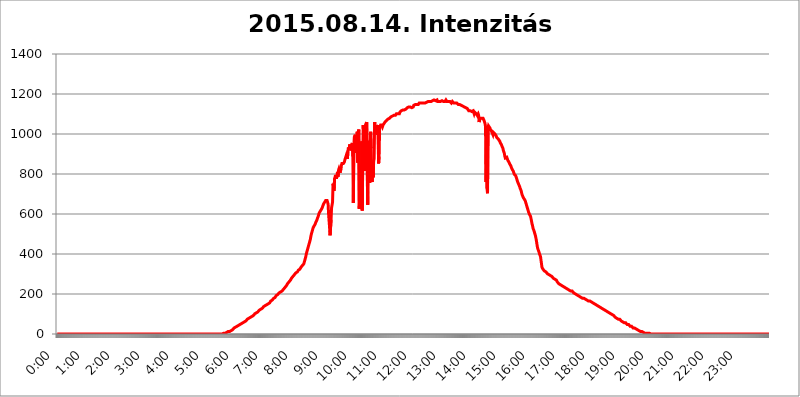
| Category | 2015.08.14. Intenzitás [W/m^2] |
|---|---|
| 0.0 | 0 |
| 0.0006944444444444445 | 0 |
| 0.001388888888888889 | 0 |
| 0.0020833333333333333 | 0 |
| 0.002777777777777778 | 0 |
| 0.003472222222222222 | 0 |
| 0.004166666666666667 | 0 |
| 0.004861111111111111 | 0 |
| 0.005555555555555556 | 0 |
| 0.0062499999999999995 | 0 |
| 0.006944444444444444 | 0 |
| 0.007638888888888889 | 0 |
| 0.008333333333333333 | 0 |
| 0.009027777777777779 | 0 |
| 0.009722222222222222 | 0 |
| 0.010416666666666666 | 0 |
| 0.011111111111111112 | 0 |
| 0.011805555555555555 | 0 |
| 0.012499999999999999 | 0 |
| 0.013194444444444444 | 0 |
| 0.013888888888888888 | 0 |
| 0.014583333333333332 | 0 |
| 0.015277777777777777 | 0 |
| 0.015972222222222224 | 0 |
| 0.016666666666666666 | 0 |
| 0.017361111111111112 | 0 |
| 0.018055555555555557 | 0 |
| 0.01875 | 0 |
| 0.019444444444444445 | 0 |
| 0.02013888888888889 | 0 |
| 0.020833333333333332 | 0 |
| 0.02152777777777778 | 0 |
| 0.022222222222222223 | 0 |
| 0.02291666666666667 | 0 |
| 0.02361111111111111 | 0 |
| 0.024305555555555556 | 0 |
| 0.024999999999999998 | 0 |
| 0.025694444444444447 | 0 |
| 0.02638888888888889 | 0 |
| 0.027083333333333334 | 0 |
| 0.027777777777777776 | 0 |
| 0.02847222222222222 | 0 |
| 0.029166666666666664 | 0 |
| 0.029861111111111113 | 0 |
| 0.030555555555555555 | 0 |
| 0.03125 | 0 |
| 0.03194444444444445 | 0 |
| 0.03263888888888889 | 0 |
| 0.03333333333333333 | 0 |
| 0.034027777777777775 | 0 |
| 0.034722222222222224 | 0 |
| 0.035416666666666666 | 0 |
| 0.036111111111111115 | 0 |
| 0.03680555555555556 | 0 |
| 0.0375 | 0 |
| 0.03819444444444444 | 0 |
| 0.03888888888888889 | 0 |
| 0.03958333333333333 | 0 |
| 0.04027777777777778 | 0 |
| 0.04097222222222222 | 0 |
| 0.041666666666666664 | 0 |
| 0.042361111111111106 | 0 |
| 0.04305555555555556 | 0 |
| 0.043750000000000004 | 0 |
| 0.044444444444444446 | 0 |
| 0.04513888888888889 | 0 |
| 0.04583333333333334 | 0 |
| 0.04652777777777778 | 0 |
| 0.04722222222222222 | 0 |
| 0.04791666666666666 | 0 |
| 0.04861111111111111 | 0 |
| 0.049305555555555554 | 0 |
| 0.049999999999999996 | 0 |
| 0.05069444444444445 | 0 |
| 0.051388888888888894 | 0 |
| 0.052083333333333336 | 0 |
| 0.05277777777777778 | 0 |
| 0.05347222222222222 | 0 |
| 0.05416666666666667 | 0 |
| 0.05486111111111111 | 0 |
| 0.05555555555555555 | 0 |
| 0.05625 | 0 |
| 0.05694444444444444 | 0 |
| 0.057638888888888885 | 0 |
| 0.05833333333333333 | 0 |
| 0.05902777777777778 | 0 |
| 0.059722222222222225 | 0 |
| 0.06041666666666667 | 0 |
| 0.061111111111111116 | 0 |
| 0.06180555555555556 | 0 |
| 0.0625 | 0 |
| 0.06319444444444444 | 0 |
| 0.06388888888888888 | 0 |
| 0.06458333333333334 | 0 |
| 0.06527777777777778 | 0 |
| 0.06597222222222222 | 0 |
| 0.06666666666666667 | 0 |
| 0.06736111111111111 | 0 |
| 0.06805555555555555 | 0 |
| 0.06874999999999999 | 0 |
| 0.06944444444444443 | 0 |
| 0.07013888888888889 | 0 |
| 0.07083333333333333 | 0 |
| 0.07152777777777779 | 0 |
| 0.07222222222222223 | 0 |
| 0.07291666666666667 | 0 |
| 0.07361111111111111 | 0 |
| 0.07430555555555556 | 0 |
| 0.075 | 0 |
| 0.07569444444444444 | 0 |
| 0.0763888888888889 | 0 |
| 0.07708333333333334 | 0 |
| 0.07777777777777778 | 0 |
| 0.07847222222222222 | 0 |
| 0.07916666666666666 | 0 |
| 0.0798611111111111 | 0 |
| 0.08055555555555556 | 0 |
| 0.08125 | 0 |
| 0.08194444444444444 | 0 |
| 0.08263888888888889 | 0 |
| 0.08333333333333333 | 0 |
| 0.08402777777777777 | 0 |
| 0.08472222222222221 | 0 |
| 0.08541666666666665 | 0 |
| 0.08611111111111112 | 0 |
| 0.08680555555555557 | 0 |
| 0.08750000000000001 | 0 |
| 0.08819444444444445 | 0 |
| 0.08888888888888889 | 0 |
| 0.08958333333333333 | 0 |
| 0.09027777777777778 | 0 |
| 0.09097222222222222 | 0 |
| 0.09166666666666667 | 0 |
| 0.09236111111111112 | 0 |
| 0.09305555555555556 | 0 |
| 0.09375 | 0 |
| 0.09444444444444444 | 0 |
| 0.09513888888888888 | 0 |
| 0.09583333333333333 | 0 |
| 0.09652777777777777 | 0 |
| 0.09722222222222222 | 0 |
| 0.09791666666666667 | 0 |
| 0.09861111111111111 | 0 |
| 0.09930555555555555 | 0 |
| 0.09999999999999999 | 0 |
| 0.10069444444444443 | 0 |
| 0.1013888888888889 | 0 |
| 0.10208333333333335 | 0 |
| 0.10277777777777779 | 0 |
| 0.10347222222222223 | 0 |
| 0.10416666666666667 | 0 |
| 0.10486111111111111 | 0 |
| 0.10555555555555556 | 0 |
| 0.10625 | 0 |
| 0.10694444444444444 | 0 |
| 0.1076388888888889 | 0 |
| 0.10833333333333334 | 0 |
| 0.10902777777777778 | 0 |
| 0.10972222222222222 | 0 |
| 0.1111111111111111 | 0 |
| 0.11180555555555556 | 0 |
| 0.11180555555555556 | 0 |
| 0.1125 | 0 |
| 0.11319444444444444 | 0 |
| 0.11388888888888889 | 0 |
| 0.11458333333333333 | 0 |
| 0.11527777777777777 | 0 |
| 0.11597222222222221 | 0 |
| 0.11666666666666665 | 0 |
| 0.1173611111111111 | 0 |
| 0.11805555555555557 | 0 |
| 0.11944444444444445 | 0 |
| 0.12013888888888889 | 0 |
| 0.12083333333333333 | 0 |
| 0.12152777777777778 | 0 |
| 0.12222222222222223 | 0 |
| 0.12291666666666667 | 0 |
| 0.12291666666666667 | 0 |
| 0.12361111111111112 | 0 |
| 0.12430555555555556 | 0 |
| 0.125 | 0 |
| 0.12569444444444444 | 0 |
| 0.12638888888888888 | 0 |
| 0.12708333333333333 | 0 |
| 0.16875 | 0 |
| 0.12847222222222224 | 0 |
| 0.12916666666666668 | 0 |
| 0.12986111111111112 | 0 |
| 0.13055555555555556 | 0 |
| 0.13125 | 0 |
| 0.13194444444444445 | 0 |
| 0.1326388888888889 | 0 |
| 0.13333333333333333 | 0 |
| 0.13402777777777777 | 0 |
| 0.13402777777777777 | 0 |
| 0.13472222222222222 | 0 |
| 0.13541666666666666 | 0 |
| 0.1361111111111111 | 0 |
| 0.13749999999999998 | 0 |
| 0.13819444444444443 | 0 |
| 0.1388888888888889 | 0 |
| 0.13958333333333334 | 0 |
| 0.14027777777777778 | 0 |
| 0.14097222222222222 | 0 |
| 0.14166666666666666 | 0 |
| 0.1423611111111111 | 0 |
| 0.14305555555555557 | 0 |
| 0.14375000000000002 | 0 |
| 0.14444444444444446 | 0 |
| 0.1451388888888889 | 0 |
| 0.1451388888888889 | 0 |
| 0.14652777777777778 | 0 |
| 0.14722222222222223 | 0 |
| 0.14791666666666667 | 0 |
| 0.1486111111111111 | 0 |
| 0.14930555555555555 | 0 |
| 0.15 | 0 |
| 0.15069444444444444 | 0 |
| 0.15138888888888888 | 0 |
| 0.15208333333333332 | 0 |
| 0.15277777777777776 | 0 |
| 0.15347222222222223 | 0 |
| 0.15416666666666667 | 0 |
| 0.15486111111111112 | 0 |
| 0.15555555555555556 | 0 |
| 0.15625 | 0 |
| 0.15694444444444444 | 0 |
| 0.15763888888888888 | 0 |
| 0.15833333333333333 | 0 |
| 0.15902777777777777 | 0 |
| 0.15972222222222224 | 0 |
| 0.16041666666666668 | 0 |
| 0.16111111111111112 | 0 |
| 0.16180555555555556 | 0 |
| 0.1625 | 0 |
| 0.16319444444444445 | 0 |
| 0.1638888888888889 | 0 |
| 0.16458333333333333 | 0 |
| 0.16527777777777777 | 0 |
| 0.16597222222222222 | 0 |
| 0.16666666666666666 | 0 |
| 0.1673611111111111 | 0 |
| 0.16805555555555554 | 0 |
| 0.16874999999999998 | 0 |
| 0.16944444444444443 | 0 |
| 0.17013888888888887 | 0 |
| 0.1708333333333333 | 0 |
| 0.17152777777777775 | 0 |
| 0.17222222222222225 | 0 |
| 0.1729166666666667 | 0 |
| 0.17361111111111113 | 0 |
| 0.17430555555555557 | 0 |
| 0.17500000000000002 | 0 |
| 0.17569444444444446 | 0 |
| 0.1763888888888889 | 0 |
| 0.17708333333333334 | 0 |
| 0.17777777777777778 | 0 |
| 0.17847222222222223 | 0 |
| 0.17916666666666667 | 0 |
| 0.1798611111111111 | 0 |
| 0.18055555555555555 | 0 |
| 0.18125 | 0 |
| 0.18194444444444444 | 0 |
| 0.1826388888888889 | 0 |
| 0.18333333333333335 | 0 |
| 0.1840277777777778 | 0 |
| 0.18472222222222223 | 0 |
| 0.18541666666666667 | 0 |
| 0.18611111111111112 | 0 |
| 0.18680555555555556 | 0 |
| 0.1875 | 0 |
| 0.18819444444444444 | 0 |
| 0.18888888888888888 | 0 |
| 0.18958333333333333 | 0 |
| 0.19027777777777777 | 0 |
| 0.1909722222222222 | 0 |
| 0.19166666666666665 | 0 |
| 0.19236111111111112 | 0 |
| 0.19305555555555554 | 0 |
| 0.19375 | 0 |
| 0.19444444444444445 | 0 |
| 0.1951388888888889 | 0 |
| 0.19583333333333333 | 0 |
| 0.19652777777777777 | 0 |
| 0.19722222222222222 | 0 |
| 0.19791666666666666 | 0 |
| 0.1986111111111111 | 0 |
| 0.19930555555555554 | 0 |
| 0.19999999999999998 | 0 |
| 0.20069444444444443 | 0 |
| 0.20138888888888887 | 0 |
| 0.2020833333333333 | 0 |
| 0.2027777777777778 | 0 |
| 0.2034722222222222 | 0 |
| 0.2041666666666667 | 0 |
| 0.20486111111111113 | 0 |
| 0.20555555555555557 | 0 |
| 0.20625000000000002 | 0 |
| 0.20694444444444446 | 0 |
| 0.2076388888888889 | 0 |
| 0.20833333333333334 | 0 |
| 0.20902777777777778 | 0 |
| 0.20972222222222223 | 0 |
| 0.21041666666666667 | 0 |
| 0.2111111111111111 | 0 |
| 0.21180555555555555 | 0 |
| 0.2125 | 0 |
| 0.21319444444444444 | 0 |
| 0.2138888888888889 | 0 |
| 0.21458333333333335 | 0 |
| 0.2152777777777778 | 0 |
| 0.21597222222222223 | 0 |
| 0.21666666666666667 | 0 |
| 0.21736111111111112 | 0 |
| 0.21805555555555556 | 0 |
| 0.21875 | 0 |
| 0.21944444444444444 | 0 |
| 0.22013888888888888 | 0 |
| 0.22083333333333333 | 0 |
| 0.22152777777777777 | 0 |
| 0.2222222222222222 | 0 |
| 0.22291666666666665 | 0 |
| 0.2236111111111111 | 0 |
| 0.22430555555555556 | 0 |
| 0.225 | 0 |
| 0.22569444444444445 | 0 |
| 0.2263888888888889 | 0 |
| 0.22708333333333333 | 0 |
| 0.22777777777777777 | 0 |
| 0.22847222222222222 | 0 |
| 0.22916666666666666 | 0 |
| 0.2298611111111111 | 0 |
| 0.23055555555555554 | 0 |
| 0.23124999999999998 | 0 |
| 0.23194444444444443 | 3.525 |
| 0.23263888888888887 | 3.525 |
| 0.2333333333333333 | 3.525 |
| 0.2340277777777778 | 3.525 |
| 0.2347222222222222 | 3.525 |
| 0.2354166666666667 | 3.525 |
| 0.23611111111111113 | 3.525 |
| 0.23680555555555557 | 7.887 |
| 0.23750000000000002 | 7.887 |
| 0.23819444444444446 | 7.887 |
| 0.2388888888888889 | 12.257 |
| 0.23958333333333334 | 12.257 |
| 0.24027777777777778 | 12.257 |
| 0.24097222222222223 | 12.257 |
| 0.24166666666666667 | 12.257 |
| 0.2423611111111111 | 16.636 |
| 0.24305555555555555 | 16.636 |
| 0.24375 | 16.636 |
| 0.24444444444444446 | 21.024 |
| 0.24513888888888888 | 21.024 |
| 0.24583333333333335 | 21.024 |
| 0.2465277777777778 | 25.419 |
| 0.24722222222222223 | 25.419 |
| 0.24791666666666667 | 29.823 |
| 0.24861111111111112 | 29.823 |
| 0.24930555555555556 | 29.823 |
| 0.25 | 34.234 |
| 0.25069444444444444 | 34.234 |
| 0.2513888888888889 | 34.234 |
| 0.2520833333333333 | 38.653 |
| 0.25277777777777777 | 38.653 |
| 0.2534722222222222 | 38.653 |
| 0.25416666666666665 | 43.079 |
| 0.2548611111111111 | 43.079 |
| 0.2555555555555556 | 47.511 |
| 0.25625000000000003 | 47.511 |
| 0.2569444444444445 | 47.511 |
| 0.2576388888888889 | 47.511 |
| 0.25833333333333336 | 51.951 |
| 0.2590277777777778 | 51.951 |
| 0.25972222222222224 | 56.398 |
| 0.2604166666666667 | 56.398 |
| 0.2611111111111111 | 56.398 |
| 0.26180555555555557 | 60.85 |
| 0.2625 | 60.85 |
| 0.26319444444444445 | 65.31 |
| 0.2638888888888889 | 65.31 |
| 0.26458333333333334 | 65.31 |
| 0.2652777777777778 | 69.775 |
| 0.2659722222222222 | 69.775 |
| 0.26666666666666666 | 74.246 |
| 0.2673611111111111 | 74.246 |
| 0.26805555555555555 | 74.246 |
| 0.26875 | 78.722 |
| 0.26944444444444443 | 78.722 |
| 0.2701388888888889 | 83.205 |
| 0.2708333333333333 | 83.205 |
| 0.27152777777777776 | 83.205 |
| 0.2722222222222222 | 87.692 |
| 0.27291666666666664 | 87.692 |
| 0.2736111111111111 | 92.184 |
| 0.2743055555555555 | 92.184 |
| 0.27499999999999997 | 92.184 |
| 0.27569444444444446 | 96.682 |
| 0.27638888888888885 | 96.682 |
| 0.27708333333333335 | 101.184 |
| 0.2777777777777778 | 101.184 |
| 0.27847222222222223 | 105.69 |
| 0.2791666666666667 | 105.69 |
| 0.2798611111111111 | 110.201 |
| 0.28055555555555556 | 110.201 |
| 0.28125 | 110.201 |
| 0.28194444444444444 | 114.716 |
| 0.2826388888888889 | 114.716 |
| 0.2833333333333333 | 119.235 |
| 0.28402777777777777 | 119.235 |
| 0.2847222222222222 | 119.235 |
| 0.28541666666666665 | 123.758 |
| 0.28611111111111115 | 123.758 |
| 0.28680555555555554 | 128.284 |
| 0.28750000000000003 | 128.284 |
| 0.2881944444444445 | 128.284 |
| 0.2888888888888889 | 132.814 |
| 0.28958333333333336 | 137.347 |
| 0.2902777777777778 | 137.347 |
| 0.29097222222222224 | 137.347 |
| 0.2916666666666667 | 141.884 |
| 0.2923611111111111 | 141.884 |
| 0.29305555555555557 | 141.884 |
| 0.29375 | 146.423 |
| 0.29444444444444445 | 146.423 |
| 0.2951388888888889 | 150.964 |
| 0.29583333333333334 | 150.964 |
| 0.2965277777777778 | 155.509 |
| 0.2972222222222222 | 155.509 |
| 0.29791666666666666 | 155.509 |
| 0.2986111111111111 | 160.056 |
| 0.29930555555555555 | 164.605 |
| 0.3 | 164.605 |
| 0.30069444444444443 | 169.156 |
| 0.3013888888888889 | 169.156 |
| 0.3020833333333333 | 173.709 |
| 0.30277777777777776 | 173.709 |
| 0.3034722222222222 | 178.264 |
| 0.30416666666666664 | 182.82 |
| 0.3048611111111111 | 182.82 |
| 0.3055555555555555 | 182.82 |
| 0.30624999999999997 | 187.378 |
| 0.3069444444444444 | 191.937 |
| 0.3076388888888889 | 191.937 |
| 0.30833333333333335 | 196.497 |
| 0.3090277777777778 | 196.497 |
| 0.30972222222222223 | 201.058 |
| 0.3104166666666667 | 201.058 |
| 0.3111111111111111 | 205.62 |
| 0.31180555555555556 | 205.62 |
| 0.3125 | 205.62 |
| 0.31319444444444444 | 210.182 |
| 0.3138888888888889 | 210.182 |
| 0.3145833333333333 | 214.746 |
| 0.31527777777777777 | 214.746 |
| 0.3159722222222222 | 219.309 |
| 0.31666666666666665 | 219.309 |
| 0.31736111111111115 | 223.873 |
| 0.31805555555555554 | 228.436 |
| 0.31875000000000003 | 228.436 |
| 0.3194444444444445 | 233 |
| 0.3201388888888889 | 233 |
| 0.32083333333333336 | 237.564 |
| 0.3215277777777778 | 242.127 |
| 0.32222222222222224 | 246.689 |
| 0.3229166666666667 | 251.251 |
| 0.3236111111111111 | 251.251 |
| 0.32430555555555557 | 255.813 |
| 0.325 | 260.373 |
| 0.32569444444444445 | 264.932 |
| 0.3263888888888889 | 264.932 |
| 0.32708333333333334 | 269.49 |
| 0.3277777777777778 | 274.047 |
| 0.3284722222222222 | 278.603 |
| 0.32916666666666666 | 278.603 |
| 0.3298611111111111 | 283.156 |
| 0.33055555555555555 | 287.709 |
| 0.33125 | 292.259 |
| 0.33194444444444443 | 292.259 |
| 0.3326388888888889 | 296.808 |
| 0.3333333333333333 | 296.808 |
| 0.3340277777777778 | 301.354 |
| 0.3347222222222222 | 305.898 |
| 0.3354166666666667 | 305.898 |
| 0.3361111111111111 | 310.44 |
| 0.3368055555555556 | 310.44 |
| 0.33749999999999997 | 314.98 |
| 0.33819444444444446 | 319.517 |
| 0.33888888888888885 | 319.517 |
| 0.33958333333333335 | 324.052 |
| 0.34027777777777773 | 324.052 |
| 0.34097222222222223 | 328.584 |
| 0.3416666666666666 | 333.113 |
| 0.3423611111111111 | 337.639 |
| 0.3430555555555555 | 337.639 |
| 0.34375 | 342.162 |
| 0.3444444444444445 | 342.162 |
| 0.3451388888888889 | 346.682 |
| 0.3458333333333334 | 351.198 |
| 0.34652777777777777 | 360.221 |
| 0.34722222222222227 | 369.23 |
| 0.34791666666666665 | 378.224 |
| 0.34861111111111115 | 387.202 |
| 0.34930555555555554 | 400.638 |
| 0.35000000000000003 | 409.574 |
| 0.3506944444444444 | 418.492 |
| 0.3513888888888889 | 427.39 |
| 0.3520833333333333 | 436.27 |
| 0.3527777777777778 | 445.129 |
| 0.3534722222222222 | 453.968 |
| 0.3541666666666667 | 462.786 |
| 0.3548611111111111 | 471.582 |
| 0.35555555555555557 | 484.735 |
| 0.35625 | 497.836 |
| 0.35694444444444445 | 506.542 |
| 0.3576388888888889 | 515.223 |
| 0.35833333333333334 | 523.88 |
| 0.3590277777777778 | 532.513 |
| 0.3597222222222222 | 532.513 |
| 0.36041666666666666 | 541.121 |
| 0.3611111111111111 | 545.416 |
| 0.36180555555555555 | 549.704 |
| 0.3625 | 558.261 |
| 0.36319444444444443 | 562.53 |
| 0.3638888888888889 | 566.793 |
| 0.3645833333333333 | 575.299 |
| 0.3652777777777778 | 579.542 |
| 0.3659722222222222 | 588.009 |
| 0.3666666666666667 | 596.45 |
| 0.3673611111111111 | 604.864 |
| 0.3680555555555556 | 609.062 |
| 0.36874999999999997 | 613.252 |
| 0.36944444444444446 | 617.436 |
| 0.37013888888888885 | 621.613 |
| 0.37083333333333335 | 625.784 |
| 0.37152777777777773 | 629.948 |
| 0.37222222222222223 | 638.256 |
| 0.3729166666666666 | 642.4 |
| 0.3736111111111111 | 650.667 |
| 0.3743055555555555 | 654.791 |
| 0.375 | 658.909 |
| 0.3756944444444445 | 663.019 |
| 0.3763888888888889 | 667.123 |
| 0.3770833333333334 | 671.22 |
| 0.37777777777777777 | 671.22 |
| 0.37847222222222227 | 667.123 |
| 0.37916666666666665 | 667.123 |
| 0.37986111111111115 | 650.667 |
| 0.38055555555555554 | 600.661 |
| 0.38125000000000003 | 600.661 |
| 0.3819444444444444 | 532.513 |
| 0.3826388888888889 | 493.475 |
| 0.3833333333333333 | 497.836 |
| 0.3840277777777778 | 571.049 |
| 0.3847222222222222 | 629.948 |
| 0.3854166666666667 | 625.784 |
| 0.3861111111111111 | 658.909 |
| 0.38680555555555557 | 751.803 |
| 0.3875 | 739.877 |
| 0.38819444444444445 | 715.858 |
| 0.3888888888888889 | 775.492 |
| 0.38958333333333334 | 783.342 |
| 0.3902777777777778 | 795.074 |
| 0.3909722222222222 | 791.169 |
| 0.39166666666666666 | 775.492 |
| 0.3923611111111111 | 795.074 |
| 0.39305555555555555 | 810.641 |
| 0.39375 | 787.258 |
| 0.39444444444444443 | 818.392 |
| 0.3951388888888889 | 826.123 |
| 0.3958333333333333 | 818.392 |
| 0.3965277777777778 | 806.757 |
| 0.3972222222222222 | 814.519 |
| 0.3979166666666667 | 822.26 |
| 0.3986111111111111 | 845.365 |
| 0.3993055555555556 | 853.029 |
| 0.39999999999999997 | 853.029 |
| 0.40069444444444446 | 853.029 |
| 0.40138888888888885 | 853.029 |
| 0.40208333333333335 | 853.029 |
| 0.40277777777777773 | 860.676 |
| 0.40347222222222223 | 872.114 |
| 0.4041666666666666 | 875.918 |
| 0.4048611111111111 | 875.918 |
| 0.4055555555555555 | 894.885 |
| 0.40625 | 887.309 |
| 0.4069444444444445 | 875.918 |
| 0.4076388888888889 | 909.996 |
| 0.4083333333333334 | 932.576 |
| 0.40902777777777777 | 921.298 |
| 0.40972222222222227 | 921.298 |
| 0.41041666666666665 | 947.58 |
| 0.41111111111111115 | 936.33 |
| 0.41180555555555554 | 917.534 |
| 0.41250000000000003 | 947.58 |
| 0.4131944444444444 | 940.082 |
| 0.4138888888888889 | 955.071 |
| 0.4145833333333333 | 887.309 |
| 0.4152777777777778 | 654.791 |
| 0.4159722222222222 | 940.082 |
| 0.4166666666666667 | 984.98 |
| 0.4173611111111111 | 984.98 |
| 0.41805555555555557 | 996.182 |
| 0.41875 | 906.223 |
| 0.41944444444444445 | 973.772 |
| 0.4201388888888889 | 955.071 |
| 0.42083333333333334 | 1011.118 |
| 0.4215277777777778 | 856.855 |
| 0.4222222222222222 | 1007.383 |
| 0.42291666666666666 | 1022.323 |
| 0.4236111111111111 | 625.784 |
| 0.42430555555555555 | 699.717 |
| 0.425 | 779.42 |
| 0.42569444444444443 | 845.365 |
| 0.4263888888888889 | 629.948 |
| 0.4270833333333333 | 962.555 |
| 0.4277777777777778 | 617.436 |
| 0.4284722222222222 | 875.918 |
| 0.4291666666666667 | 1044.762 |
| 0.4298611111111111 | 1048.508 |
| 0.4305555555555556 | 906.223 |
| 0.43124999999999997 | 1044.762 |
| 0.43194444444444446 | 814.519 |
| 0.43263888888888885 | 1048.508 |
| 0.43333333333333335 | 1044.762 |
| 0.43402777777777773 | 1059.756 |
| 0.43472222222222223 | 1059.756 |
| 0.4354166666666666 | 646.537 |
| 0.4361111111111111 | 958.814 |
| 0.4368055555555555 | 966.295 |
| 0.4375 | 802.868 |
| 0.4381944444444445 | 755.766 |
| 0.4388888888888889 | 879.719 |
| 0.4395833333333334 | 1011.118 |
| 0.44027777777777777 | 928.819 |
| 0.44097222222222227 | 806.757 |
| 0.44166666666666665 | 759.723 |
| 0.44236111111111115 | 829.981 |
| 0.44305555555555554 | 783.342 |
| 0.44375000000000003 | 864.493 |
| 0.4444444444444444 | 875.918 |
| 0.4451388888888889 | 1059.756 |
| 0.4458333333333333 | 1059.756 |
| 0.4465277777777778 | 999.916 |
| 0.4472222222222222 | 1044.762 |
| 0.4479166666666667 | 1037.277 |
| 0.4486111111111111 | 1041.019 |
| 0.44930555555555557 | 996.182 |
| 0.45 | 1044.762 |
| 0.45069444444444445 | 853.029 |
| 0.4513888888888889 | 887.309 |
| 0.45208333333333334 | 1022.323 |
| 0.4527777777777778 | 1037.277 |
| 0.4534722222222222 | 1044.762 |
| 0.45416666666666666 | 1044.762 |
| 0.4548611111111111 | 1041.019 |
| 0.45555555555555555 | 1044.762 |
| 0.45625 | 1037.277 |
| 0.45694444444444443 | 1044.762 |
| 0.4576388888888889 | 1048.508 |
| 0.4583333333333333 | 1052.255 |
| 0.4590277777777778 | 1052.255 |
| 0.4597222222222222 | 1059.756 |
| 0.4604166666666667 | 1059.756 |
| 0.4611111111111111 | 1063.51 |
| 0.4618055555555556 | 1067.267 |
| 0.46249999999999997 | 1071.027 |
| 0.46319444444444446 | 1071.027 |
| 0.46388888888888885 | 1074.789 |
| 0.46458333333333335 | 1074.789 |
| 0.46527777777777773 | 1074.789 |
| 0.46597222222222223 | 1078.555 |
| 0.4666666666666666 | 1082.324 |
| 0.4673611111111111 | 1082.324 |
| 0.4680555555555555 | 1086.097 |
| 0.46875 | 1086.097 |
| 0.4694444444444445 | 1086.097 |
| 0.4701388888888889 | 1089.873 |
| 0.4708333333333334 | 1089.873 |
| 0.47152777777777777 | 1093.653 |
| 0.47222222222222227 | 1093.653 |
| 0.47291666666666665 | 1093.653 |
| 0.47361111111111115 | 1093.653 |
| 0.47430555555555554 | 1093.653 |
| 0.47500000000000003 | 1097.437 |
| 0.4756944444444444 | 1101.226 |
| 0.4763888888888889 | 1105.019 |
| 0.4770833333333333 | 1101.226 |
| 0.4777777777777778 | 1101.226 |
| 0.4784722222222222 | 1101.226 |
| 0.4791666666666667 | 1101.226 |
| 0.4798611111111111 | 1101.226 |
| 0.48055555555555557 | 1108.816 |
| 0.48125 | 1108.816 |
| 0.48194444444444445 | 1112.618 |
| 0.4826388888888889 | 1116.426 |
| 0.48333333333333334 | 1116.426 |
| 0.4840277777777778 | 1116.426 |
| 0.4847222222222222 | 1120.238 |
| 0.48541666666666666 | 1120.238 |
| 0.4861111111111111 | 1120.238 |
| 0.48680555555555555 | 1120.238 |
| 0.4875 | 1120.238 |
| 0.48819444444444443 | 1124.056 |
| 0.4888888888888889 | 1124.056 |
| 0.4895833333333333 | 1127.879 |
| 0.4902777777777778 | 1127.879 |
| 0.4909722222222222 | 1131.708 |
| 0.4916666666666667 | 1131.708 |
| 0.4923611111111111 | 1135.543 |
| 0.4930555555555556 | 1135.543 |
| 0.49374999999999997 | 1135.543 |
| 0.49444444444444446 | 1139.384 |
| 0.49513888888888885 | 1135.543 |
| 0.49583333333333335 | 1135.543 |
| 0.49652777777777773 | 1131.708 |
| 0.49722222222222223 | 1131.708 |
| 0.4979166666666666 | 1135.543 |
| 0.4986111111111111 | 1135.543 |
| 0.4993055555555555 | 1135.543 |
| 0.5 | 1143.232 |
| 0.5006944444444444 | 1147.086 |
| 0.5013888888888889 | 1143.232 |
| 0.5020833333333333 | 1147.086 |
| 0.5027777777777778 | 1147.086 |
| 0.5034722222222222 | 1147.086 |
| 0.5041666666666667 | 1147.086 |
| 0.5048611111111111 | 1147.086 |
| 0.5055555555555555 | 1147.086 |
| 0.50625 | 1147.086 |
| 0.5069444444444444 | 1150.946 |
| 0.5076388888888889 | 1154.814 |
| 0.5083333333333333 | 1158.689 |
| 0.5090277777777777 | 1154.814 |
| 0.5097222222222222 | 1154.814 |
| 0.5104166666666666 | 1154.814 |
| 0.5111111111111112 | 1154.814 |
| 0.5118055555555555 | 1154.814 |
| 0.5125000000000001 | 1154.814 |
| 0.5131944444444444 | 1154.814 |
| 0.513888888888889 | 1154.814 |
| 0.5145833333333333 | 1154.814 |
| 0.5152777777777778 | 1158.689 |
| 0.5159722222222222 | 1154.814 |
| 0.5166666666666667 | 1154.814 |
| 0.517361111111111 | 1158.689 |
| 0.5180555555555556 | 1158.689 |
| 0.5187499999999999 | 1162.571 |
| 0.5194444444444445 | 1162.571 |
| 0.5201388888888888 | 1162.571 |
| 0.5208333333333334 | 1162.571 |
| 0.5215277777777778 | 1166.46 |
| 0.5222222222222223 | 1162.571 |
| 0.5229166666666667 | 1162.571 |
| 0.5236111111111111 | 1162.571 |
| 0.5243055555555556 | 1162.571 |
| 0.525 | 1166.46 |
| 0.5256944444444445 | 1166.46 |
| 0.5263888888888889 | 1166.46 |
| 0.5270833333333333 | 1170.358 |
| 0.5277777777777778 | 1170.358 |
| 0.5284722222222222 | 1170.358 |
| 0.5291666666666667 | 1166.46 |
| 0.5298611111111111 | 1166.46 |
| 0.5305555555555556 | 1166.46 |
| 0.53125 | 1170.358 |
| 0.5319444444444444 | 1170.358 |
| 0.5326388888888889 | 1170.358 |
| 0.5333333333333333 | 1162.571 |
| 0.5340277777777778 | 1162.571 |
| 0.5347222222222222 | 1162.571 |
| 0.5354166666666667 | 1162.571 |
| 0.5361111111111111 | 1162.571 |
| 0.5368055555555555 | 1162.571 |
| 0.5375 | 1162.571 |
| 0.5381944444444444 | 1162.571 |
| 0.5388888888888889 | 1162.571 |
| 0.5395833333333333 | 1166.46 |
| 0.5402777777777777 | 1166.46 |
| 0.5409722222222222 | 1166.46 |
| 0.5416666666666666 | 1162.571 |
| 0.5423611111111112 | 1162.571 |
| 0.5430555555555555 | 1166.46 |
| 0.5437500000000001 | 1162.571 |
| 0.5444444444444444 | 1166.46 |
| 0.545138888888889 | 1170.358 |
| 0.5458333333333333 | 1166.46 |
| 0.5465277777777778 | 1162.571 |
| 0.5472222222222222 | 1166.46 |
| 0.5479166666666667 | 1162.571 |
| 0.548611111111111 | 1162.571 |
| 0.5493055555555556 | 1166.46 |
| 0.5499999999999999 | 1162.571 |
| 0.5506944444444445 | 1162.571 |
| 0.5513888888888888 | 1158.689 |
| 0.5520833333333334 | 1158.689 |
| 0.5527777777777778 | 1154.814 |
| 0.5534722222222223 | 1158.689 |
| 0.5541666666666667 | 1162.571 |
| 0.5548611111111111 | 1162.571 |
| 0.5555555555555556 | 1158.689 |
| 0.55625 | 1154.814 |
| 0.5569444444444445 | 1154.814 |
| 0.5576388888888889 | 1154.814 |
| 0.5583333333333333 | 1154.814 |
| 0.5590277777777778 | 1154.814 |
| 0.5597222222222222 | 1158.689 |
| 0.5604166666666667 | 1154.814 |
| 0.5611111111111111 | 1154.814 |
| 0.5618055555555556 | 1150.946 |
| 0.5625 | 1147.086 |
| 0.5631944444444444 | 1150.946 |
| 0.5638888888888889 | 1150.946 |
| 0.5645833333333333 | 1147.086 |
| 0.5652777777777778 | 1147.086 |
| 0.5659722222222222 | 1147.086 |
| 0.5666666666666667 | 1143.232 |
| 0.5673611111111111 | 1143.232 |
| 0.5680555555555555 | 1143.232 |
| 0.56875 | 1139.384 |
| 0.5694444444444444 | 1139.384 |
| 0.5701388888888889 | 1135.543 |
| 0.5708333333333333 | 1135.543 |
| 0.5715277777777777 | 1131.708 |
| 0.5722222222222222 | 1131.708 |
| 0.5729166666666666 | 1131.708 |
| 0.5736111111111112 | 1127.879 |
| 0.5743055555555555 | 1127.879 |
| 0.5750000000000001 | 1127.879 |
| 0.5756944444444444 | 1124.056 |
| 0.576388888888889 | 1124.056 |
| 0.5770833333333333 | 1116.426 |
| 0.5777777777777778 | 1116.426 |
| 0.5784722222222222 | 1116.426 |
| 0.5791666666666667 | 1116.426 |
| 0.579861111111111 | 1116.426 |
| 0.5805555555555556 | 1116.426 |
| 0.5812499999999999 | 1112.618 |
| 0.5819444444444445 | 1112.618 |
| 0.5826388888888888 | 1112.618 |
| 0.5833333333333334 | 1116.426 |
| 0.5840277777777778 | 1112.618 |
| 0.5847222222222223 | 1101.226 |
| 0.5854166666666667 | 1108.816 |
| 0.5861111111111111 | 1105.019 |
| 0.5868055555555556 | 1105.019 |
| 0.5875 | 1101.226 |
| 0.5881944444444445 | 1101.226 |
| 0.5888888888888889 | 1093.653 |
| 0.5895833333333333 | 1097.437 |
| 0.5902777777777778 | 1101.226 |
| 0.5909722222222222 | 1093.653 |
| 0.5916666666666667 | 1059.756 |
| 0.5923611111111111 | 1056.004 |
| 0.5930555555555556 | 1078.555 |
| 0.59375 | 1082.324 |
| 0.5944444444444444 | 1078.555 |
| 0.5951388888888889 | 1078.555 |
| 0.5958333333333333 | 1078.555 |
| 0.5965277777777778 | 1078.555 |
| 0.5972222222222222 | 1078.555 |
| 0.5979166666666667 | 1074.789 |
| 0.5986111111111111 | 1067.267 |
| 0.5993055555555555 | 1059.756 |
| 0.6 | 1052.255 |
| 0.6006944444444444 | 1037.277 |
| 0.6013888888888889 | 759.723 |
| 0.6020833333333333 | 1033.537 |
| 0.6027777777777777 | 727.896 |
| 0.6034722222222222 | 703.762 |
| 0.6041666666666666 | 1029.798 |
| 0.6048611111111112 | 1041.019 |
| 0.6055555555555555 | 1037.277 |
| 0.6062500000000001 | 1037.277 |
| 0.6069444444444444 | 1029.798 |
| 0.607638888888889 | 1022.323 |
| 0.6083333333333333 | 1018.587 |
| 0.6090277777777778 | 1014.852 |
| 0.6097222222222222 | 1007.383 |
| 0.6104166666666667 | 1007.383 |
| 0.611111111111111 | 996.182 |
| 0.6118055555555556 | 1007.383 |
| 0.6124999999999999 | 1003.65 |
| 0.6131944444444445 | 1003.65 |
| 0.6138888888888888 | 999.916 |
| 0.6145833333333334 | 996.182 |
| 0.6152777777777778 | 992.448 |
| 0.6159722222222223 | 988.714 |
| 0.6166666666666667 | 981.244 |
| 0.6173611111111111 | 981.244 |
| 0.6180555555555556 | 977.508 |
| 0.61875 | 973.772 |
| 0.6194444444444445 | 970.034 |
| 0.6201388888888889 | 970.034 |
| 0.6208333333333333 | 962.555 |
| 0.6215277777777778 | 955.071 |
| 0.6222222222222222 | 955.071 |
| 0.6229166666666667 | 947.58 |
| 0.6236111111111111 | 940.082 |
| 0.6243055555555556 | 936.33 |
| 0.625 | 928.819 |
| 0.6256944444444444 | 917.534 |
| 0.6263888888888889 | 909.996 |
| 0.6270833333333333 | 902.447 |
| 0.6277777777777778 | 887.309 |
| 0.6284722222222222 | 879.719 |
| 0.6291666666666667 | 883.516 |
| 0.6298611111111111 | 883.516 |
| 0.6305555555555555 | 883.516 |
| 0.63125 | 875.918 |
| 0.6319444444444444 | 868.305 |
| 0.6326388888888889 | 868.305 |
| 0.6333333333333333 | 860.676 |
| 0.6340277777777777 | 860.676 |
| 0.6347222222222222 | 849.199 |
| 0.6354166666666666 | 849.199 |
| 0.6361111111111112 | 841.526 |
| 0.6368055555555555 | 833.834 |
| 0.6375000000000001 | 829.981 |
| 0.6381944444444444 | 822.26 |
| 0.638888888888889 | 818.392 |
| 0.6395833333333333 | 814.519 |
| 0.6402777777777778 | 806.757 |
| 0.6409722222222222 | 798.974 |
| 0.6416666666666667 | 802.868 |
| 0.642361111111111 | 795.074 |
| 0.6430555555555556 | 791.169 |
| 0.6437499999999999 | 783.342 |
| 0.6444444444444445 | 775.492 |
| 0.6451388888888888 | 767.62 |
| 0.6458333333333334 | 759.723 |
| 0.6465277777777778 | 755.766 |
| 0.6472222222222223 | 747.834 |
| 0.6479166666666667 | 743.859 |
| 0.6486111111111111 | 735.89 |
| 0.6493055555555556 | 727.896 |
| 0.65 | 723.889 |
| 0.6506944444444445 | 715.858 |
| 0.6513888888888889 | 703.762 |
| 0.6520833333333333 | 695.666 |
| 0.6527777777777778 | 691.608 |
| 0.6534722222222222 | 683.473 |
| 0.6541666666666667 | 679.395 |
| 0.6548611111111111 | 675.311 |
| 0.6555555555555556 | 675.311 |
| 0.65625 | 667.123 |
| 0.6569444444444444 | 658.909 |
| 0.6576388888888889 | 650.667 |
| 0.6583333333333333 | 642.4 |
| 0.6590277777777778 | 634.105 |
| 0.6597222222222222 | 625.784 |
| 0.6604166666666667 | 617.436 |
| 0.6611111111111111 | 609.062 |
| 0.6618055555555555 | 604.864 |
| 0.6625 | 596.45 |
| 0.6631944444444444 | 592.233 |
| 0.6638888888888889 | 588.009 |
| 0.6645833333333333 | 575.299 |
| 0.6652777777777777 | 562.53 |
| 0.6659722222222222 | 549.704 |
| 0.6666666666666666 | 541.121 |
| 0.6673611111111111 | 528.2 |
| 0.6680555555555556 | 523.88 |
| 0.6687500000000001 | 515.223 |
| 0.6694444444444444 | 506.542 |
| 0.6701388888888888 | 497.836 |
| 0.6708333333333334 | 489.108 |
| 0.6715277777777778 | 475.972 |
| 0.6722222222222222 | 462.786 |
| 0.6729166666666666 | 445.129 |
| 0.6736111111111112 | 431.833 |
| 0.6743055555555556 | 422.943 |
| 0.6749999999999999 | 418.492 |
| 0.6756944444444444 | 409.574 |
| 0.6763888888888889 | 400.638 |
| 0.6770833333333334 | 396.164 |
| 0.6777777777777777 | 387.202 |
| 0.6784722222222223 | 369.23 |
| 0.6791666666666667 | 351.198 |
| 0.6798611111111111 | 333.113 |
| 0.6805555555555555 | 328.584 |
| 0.68125 | 324.052 |
| 0.6819444444444445 | 319.517 |
| 0.6826388888888889 | 319.517 |
| 0.6833333333333332 | 314.98 |
| 0.6840277777777778 | 314.98 |
| 0.6847222222222222 | 310.44 |
| 0.6854166666666667 | 310.44 |
| 0.686111111111111 | 305.898 |
| 0.6868055555555556 | 305.898 |
| 0.6875 | 301.354 |
| 0.6881944444444444 | 296.808 |
| 0.688888888888889 | 296.808 |
| 0.6895833333333333 | 296.808 |
| 0.6902777777777778 | 296.808 |
| 0.6909722222222222 | 292.259 |
| 0.6916666666666668 | 292.259 |
| 0.6923611111111111 | 287.709 |
| 0.6930555555555555 | 287.709 |
| 0.69375 | 287.709 |
| 0.6944444444444445 | 283.156 |
| 0.6951388888888889 | 283.156 |
| 0.6958333333333333 | 278.603 |
| 0.6965277777777777 | 278.603 |
| 0.6972222222222223 | 274.047 |
| 0.6979166666666666 | 274.047 |
| 0.6986111111111111 | 269.49 |
| 0.6993055555555556 | 269.49 |
| 0.7000000000000001 | 269.49 |
| 0.7006944444444444 | 264.932 |
| 0.7013888888888888 | 260.373 |
| 0.7020833333333334 | 260.373 |
| 0.7027777777777778 | 255.813 |
| 0.7034722222222222 | 251.251 |
| 0.7041666666666666 | 251.251 |
| 0.7048611111111112 | 246.689 |
| 0.7055555555555556 | 246.689 |
| 0.7062499999999999 | 246.689 |
| 0.7069444444444444 | 242.127 |
| 0.7076388888888889 | 242.127 |
| 0.7083333333333334 | 237.564 |
| 0.7090277777777777 | 237.564 |
| 0.7097222222222223 | 237.564 |
| 0.7104166666666667 | 237.564 |
| 0.7111111111111111 | 233 |
| 0.7118055555555555 | 233 |
| 0.7125 | 233 |
| 0.7131944444444445 | 228.436 |
| 0.7138888888888889 | 228.436 |
| 0.7145833333333332 | 228.436 |
| 0.7152777777777778 | 228.436 |
| 0.7159722222222222 | 223.873 |
| 0.7166666666666667 | 223.873 |
| 0.717361111111111 | 219.309 |
| 0.7180555555555556 | 219.309 |
| 0.71875 | 219.309 |
| 0.7194444444444444 | 214.746 |
| 0.720138888888889 | 214.746 |
| 0.7208333333333333 | 214.746 |
| 0.7215277777777778 | 214.746 |
| 0.7222222222222222 | 214.746 |
| 0.7229166666666668 | 210.182 |
| 0.7236111111111111 | 210.182 |
| 0.7243055555555555 | 205.62 |
| 0.725 | 205.62 |
| 0.7256944444444445 | 205.62 |
| 0.7263888888888889 | 201.058 |
| 0.7270833333333333 | 201.058 |
| 0.7277777777777777 | 201.058 |
| 0.7284722222222223 | 196.497 |
| 0.7291666666666666 | 196.497 |
| 0.7298611111111111 | 191.937 |
| 0.7305555555555556 | 191.937 |
| 0.7312500000000001 | 191.937 |
| 0.7319444444444444 | 187.378 |
| 0.7326388888888888 | 187.378 |
| 0.7333333333333334 | 187.378 |
| 0.7340277777777778 | 182.82 |
| 0.7347222222222222 | 182.82 |
| 0.7354166666666666 | 182.82 |
| 0.7361111111111112 | 182.82 |
| 0.7368055555555556 | 178.264 |
| 0.7374999999999999 | 178.264 |
| 0.7381944444444444 | 178.264 |
| 0.7388888888888889 | 178.264 |
| 0.7395833333333334 | 173.709 |
| 0.7402777777777777 | 173.709 |
| 0.7409722222222223 | 173.709 |
| 0.7416666666666667 | 173.709 |
| 0.7423611111111111 | 169.156 |
| 0.7430555555555555 | 169.156 |
| 0.74375 | 169.156 |
| 0.7444444444444445 | 164.605 |
| 0.7451388888888889 | 164.605 |
| 0.7458333333333332 | 164.605 |
| 0.7465277777777778 | 164.605 |
| 0.7472222222222222 | 164.605 |
| 0.7479166666666667 | 160.056 |
| 0.748611111111111 | 160.056 |
| 0.7493055555555556 | 160.056 |
| 0.75 | 155.509 |
| 0.7506944444444444 | 155.509 |
| 0.751388888888889 | 155.509 |
| 0.7520833333333333 | 155.509 |
| 0.7527777777777778 | 150.964 |
| 0.7534722222222222 | 150.964 |
| 0.7541666666666668 | 146.423 |
| 0.7548611111111111 | 146.423 |
| 0.7555555555555555 | 146.423 |
| 0.75625 | 141.884 |
| 0.7569444444444445 | 141.884 |
| 0.7576388888888889 | 141.884 |
| 0.7583333333333333 | 141.884 |
| 0.7590277777777777 | 137.347 |
| 0.7597222222222223 | 137.347 |
| 0.7604166666666666 | 137.347 |
| 0.7611111111111111 | 132.814 |
| 0.7618055555555556 | 132.814 |
| 0.7625000000000001 | 132.814 |
| 0.7631944444444444 | 128.284 |
| 0.7638888888888888 | 128.284 |
| 0.7645833333333334 | 128.284 |
| 0.7652777777777778 | 128.284 |
| 0.7659722222222222 | 123.758 |
| 0.7666666666666666 | 123.758 |
| 0.7673611111111112 | 119.235 |
| 0.7680555555555556 | 119.235 |
| 0.7687499999999999 | 119.235 |
| 0.7694444444444444 | 119.235 |
| 0.7701388888888889 | 114.716 |
| 0.7708333333333334 | 114.716 |
| 0.7715277777777777 | 110.201 |
| 0.7722222222222223 | 110.201 |
| 0.7729166666666667 | 110.201 |
| 0.7736111111111111 | 105.69 |
| 0.7743055555555555 | 105.69 |
| 0.775 | 101.184 |
| 0.7756944444444445 | 101.184 |
| 0.7763888888888889 | 101.184 |
| 0.7770833333333332 | 96.682 |
| 0.7777777777777778 | 96.682 |
| 0.7784722222222222 | 96.682 |
| 0.7791666666666667 | 92.184 |
| 0.779861111111111 | 92.184 |
| 0.7805555555555556 | 92.184 |
| 0.78125 | 87.692 |
| 0.7819444444444444 | 87.692 |
| 0.782638888888889 | 83.205 |
| 0.7833333333333333 | 83.205 |
| 0.7840277777777778 | 83.205 |
| 0.7847222222222222 | 78.722 |
| 0.7854166666666668 | 78.722 |
| 0.7861111111111111 | 78.722 |
| 0.7868055555555555 | 74.246 |
| 0.7875 | 74.246 |
| 0.7881944444444445 | 74.246 |
| 0.7888888888888889 | 74.246 |
| 0.7895833333333333 | 69.775 |
| 0.7902777777777777 | 69.775 |
| 0.7909722222222223 | 65.31 |
| 0.7916666666666666 | 65.31 |
| 0.7923611111111111 | 65.31 |
| 0.7930555555555556 | 60.85 |
| 0.7937500000000001 | 60.85 |
| 0.7944444444444444 | 60.85 |
| 0.7951388888888888 | 56.398 |
| 0.7958333333333334 | 56.398 |
| 0.7965277777777778 | 56.398 |
| 0.7972222222222222 | 56.398 |
| 0.7979166666666666 | 51.951 |
| 0.7986111111111112 | 51.951 |
| 0.7993055555555556 | 47.511 |
| 0.7999999999999999 | 47.511 |
| 0.8006944444444444 | 47.511 |
| 0.8013888888888889 | 47.511 |
| 0.8020833333333334 | 43.079 |
| 0.8027777777777777 | 43.079 |
| 0.8034722222222223 | 38.653 |
| 0.8041666666666667 | 38.653 |
| 0.8048611111111111 | 38.653 |
| 0.8055555555555555 | 38.653 |
| 0.80625 | 34.234 |
| 0.8069444444444445 | 34.234 |
| 0.8076388888888889 | 29.823 |
| 0.8083333333333332 | 29.823 |
| 0.8090277777777778 | 29.823 |
| 0.8097222222222222 | 29.823 |
| 0.8104166666666667 | 29.823 |
| 0.811111111111111 | 25.419 |
| 0.8118055555555556 | 25.419 |
| 0.8125 | 21.024 |
| 0.8131944444444444 | 21.024 |
| 0.813888888888889 | 21.024 |
| 0.8145833333333333 | 21.024 |
| 0.8152777777777778 | 16.636 |
| 0.8159722222222222 | 16.636 |
| 0.8166666666666668 | 16.636 |
| 0.8173611111111111 | 12.257 |
| 0.8180555555555555 | 12.257 |
| 0.81875 | 12.257 |
| 0.8194444444444445 | 12.257 |
| 0.8201388888888889 | 12.257 |
| 0.8208333333333333 | 7.887 |
| 0.8215277777777777 | 7.887 |
| 0.8222222222222223 | 7.887 |
| 0.8229166666666666 | 7.887 |
| 0.8236111111111111 | 3.525 |
| 0.8243055555555556 | 3.525 |
| 0.8250000000000001 | 3.525 |
| 0.8256944444444444 | 3.525 |
| 0.8263888888888888 | 3.525 |
| 0.8270833333333334 | 3.525 |
| 0.8277777777777778 | 3.525 |
| 0.8284722222222222 | 3.525 |
| 0.8291666666666666 | 3.525 |
| 0.8298611111111112 | 3.525 |
| 0.8305555555555556 | 3.525 |
| 0.8312499999999999 | 0 |
| 0.8319444444444444 | 0 |
| 0.8326388888888889 | 0 |
| 0.8333333333333334 | 0 |
| 0.8340277777777777 | 0 |
| 0.8347222222222223 | 0 |
| 0.8354166666666667 | 0 |
| 0.8361111111111111 | 0 |
| 0.8368055555555555 | 0 |
| 0.8375 | 0 |
| 0.8381944444444445 | 0 |
| 0.8388888888888889 | 0 |
| 0.8395833333333332 | 0 |
| 0.8402777777777778 | 0 |
| 0.8409722222222222 | 0 |
| 0.8416666666666667 | 0 |
| 0.842361111111111 | 0 |
| 0.8430555555555556 | 0 |
| 0.84375 | 0 |
| 0.8444444444444444 | 0 |
| 0.845138888888889 | 0 |
| 0.8458333333333333 | 0 |
| 0.8465277777777778 | 0 |
| 0.8472222222222222 | 0 |
| 0.8479166666666668 | 0 |
| 0.8486111111111111 | 0 |
| 0.8493055555555555 | 0 |
| 0.85 | 0 |
| 0.8506944444444445 | 0 |
| 0.8513888888888889 | 0 |
| 0.8520833333333333 | 0 |
| 0.8527777777777777 | 0 |
| 0.8534722222222223 | 0 |
| 0.8541666666666666 | 0 |
| 0.8548611111111111 | 0 |
| 0.8555555555555556 | 0 |
| 0.8562500000000001 | 0 |
| 0.8569444444444444 | 0 |
| 0.8576388888888888 | 0 |
| 0.8583333333333334 | 0 |
| 0.8590277777777778 | 0 |
| 0.8597222222222222 | 0 |
| 0.8604166666666666 | 0 |
| 0.8611111111111112 | 0 |
| 0.8618055555555556 | 0 |
| 0.8624999999999999 | 0 |
| 0.8631944444444444 | 0 |
| 0.8638888888888889 | 0 |
| 0.8645833333333334 | 0 |
| 0.8652777777777777 | 0 |
| 0.8659722222222223 | 0 |
| 0.8666666666666667 | 0 |
| 0.8673611111111111 | 0 |
| 0.8680555555555555 | 0 |
| 0.86875 | 0 |
| 0.8694444444444445 | 0 |
| 0.8701388888888889 | 0 |
| 0.8708333333333332 | 0 |
| 0.8715277777777778 | 0 |
| 0.8722222222222222 | 0 |
| 0.8729166666666667 | 0 |
| 0.873611111111111 | 0 |
| 0.8743055555555556 | 0 |
| 0.875 | 0 |
| 0.8756944444444444 | 0 |
| 0.876388888888889 | 0 |
| 0.8770833333333333 | 0 |
| 0.8777777777777778 | 0 |
| 0.8784722222222222 | 0 |
| 0.8791666666666668 | 0 |
| 0.8798611111111111 | 0 |
| 0.8805555555555555 | 0 |
| 0.88125 | 0 |
| 0.8819444444444445 | 0 |
| 0.8826388888888889 | 0 |
| 0.8833333333333333 | 0 |
| 0.8840277777777777 | 0 |
| 0.8847222222222223 | 0 |
| 0.8854166666666666 | 0 |
| 0.8861111111111111 | 0 |
| 0.8868055555555556 | 0 |
| 0.8875000000000001 | 0 |
| 0.8881944444444444 | 0 |
| 0.8888888888888888 | 0 |
| 0.8895833333333334 | 0 |
| 0.8902777777777778 | 0 |
| 0.8909722222222222 | 0 |
| 0.8916666666666666 | 0 |
| 0.8923611111111112 | 0 |
| 0.8930555555555556 | 0 |
| 0.8937499999999999 | 0 |
| 0.8944444444444444 | 0 |
| 0.8951388888888889 | 0 |
| 0.8958333333333334 | 0 |
| 0.8965277777777777 | 0 |
| 0.8972222222222223 | 0 |
| 0.8979166666666667 | 0 |
| 0.8986111111111111 | 0 |
| 0.8993055555555555 | 0 |
| 0.9 | 0 |
| 0.9006944444444445 | 0 |
| 0.9013888888888889 | 0 |
| 0.9020833333333332 | 0 |
| 0.9027777777777778 | 0 |
| 0.9034722222222222 | 0 |
| 0.9041666666666667 | 0 |
| 0.904861111111111 | 0 |
| 0.9055555555555556 | 0 |
| 0.90625 | 0 |
| 0.9069444444444444 | 0 |
| 0.907638888888889 | 0 |
| 0.9083333333333333 | 0 |
| 0.9090277777777778 | 0 |
| 0.9097222222222222 | 0 |
| 0.9104166666666668 | 0 |
| 0.9111111111111111 | 0 |
| 0.9118055555555555 | 0 |
| 0.9125 | 0 |
| 0.9131944444444445 | 0 |
| 0.9138888888888889 | 0 |
| 0.9145833333333333 | 0 |
| 0.9152777777777777 | 0 |
| 0.9159722222222223 | 0 |
| 0.9166666666666666 | 0 |
| 0.9173611111111111 | 0 |
| 0.9180555555555556 | 0 |
| 0.9187500000000001 | 0 |
| 0.9194444444444444 | 0 |
| 0.9201388888888888 | 0 |
| 0.9208333333333334 | 0 |
| 0.9215277777777778 | 0 |
| 0.9222222222222222 | 0 |
| 0.9229166666666666 | 0 |
| 0.9236111111111112 | 0 |
| 0.9243055555555556 | 0 |
| 0.9249999999999999 | 0 |
| 0.9256944444444444 | 0 |
| 0.9263888888888889 | 0 |
| 0.9270833333333334 | 0 |
| 0.9277777777777777 | 0 |
| 0.9284722222222223 | 0 |
| 0.9291666666666667 | 0 |
| 0.9298611111111111 | 0 |
| 0.9305555555555555 | 0 |
| 0.93125 | 0 |
| 0.9319444444444445 | 0 |
| 0.9326388888888889 | 0 |
| 0.9333333333333332 | 0 |
| 0.9340277777777778 | 0 |
| 0.9347222222222222 | 0 |
| 0.9354166666666667 | 0 |
| 0.936111111111111 | 0 |
| 0.9368055555555556 | 0 |
| 0.9375 | 0 |
| 0.9381944444444444 | 0 |
| 0.938888888888889 | 0 |
| 0.9395833333333333 | 0 |
| 0.9402777777777778 | 0 |
| 0.9409722222222222 | 0 |
| 0.9416666666666668 | 0 |
| 0.9423611111111111 | 0 |
| 0.9430555555555555 | 0 |
| 0.94375 | 0 |
| 0.9444444444444445 | 0 |
| 0.9451388888888889 | 0 |
| 0.9458333333333333 | 0 |
| 0.9465277777777777 | 0 |
| 0.9472222222222223 | 0 |
| 0.9479166666666666 | 0 |
| 0.9486111111111111 | 0 |
| 0.9493055555555556 | 0 |
| 0.9500000000000001 | 0 |
| 0.9506944444444444 | 0 |
| 0.9513888888888888 | 0 |
| 0.9520833333333334 | 0 |
| 0.9527777777777778 | 0 |
| 0.9534722222222222 | 0 |
| 0.9541666666666666 | 0 |
| 0.9548611111111112 | 0 |
| 0.9555555555555556 | 0 |
| 0.9562499999999999 | 0 |
| 0.9569444444444444 | 0 |
| 0.9576388888888889 | 0 |
| 0.9583333333333334 | 0 |
| 0.9590277777777777 | 0 |
| 0.9597222222222223 | 0 |
| 0.9604166666666667 | 0 |
| 0.9611111111111111 | 0 |
| 0.9618055555555555 | 0 |
| 0.9625 | 0 |
| 0.9631944444444445 | 0 |
| 0.9638888888888889 | 0 |
| 0.9645833333333332 | 0 |
| 0.9652777777777778 | 0 |
| 0.9659722222222222 | 0 |
| 0.9666666666666667 | 0 |
| 0.967361111111111 | 0 |
| 0.9680555555555556 | 0 |
| 0.96875 | 0 |
| 0.9694444444444444 | 0 |
| 0.970138888888889 | 0 |
| 0.9708333333333333 | 0 |
| 0.9715277777777778 | 0 |
| 0.9722222222222222 | 0 |
| 0.9729166666666668 | 0 |
| 0.9736111111111111 | 0 |
| 0.9743055555555555 | 0 |
| 0.975 | 0 |
| 0.9756944444444445 | 0 |
| 0.9763888888888889 | 0 |
| 0.9770833333333333 | 0 |
| 0.9777777777777777 | 0 |
| 0.9784722222222223 | 0 |
| 0.9791666666666666 | 0 |
| 0.9798611111111111 | 0 |
| 0.9805555555555556 | 0 |
| 0.9812500000000001 | 0 |
| 0.9819444444444444 | 0 |
| 0.9826388888888888 | 0 |
| 0.9833333333333334 | 0 |
| 0.9840277777777778 | 0 |
| 0.9847222222222222 | 0 |
| 0.9854166666666666 | 0 |
| 0.9861111111111112 | 0 |
| 0.9868055555555556 | 0 |
| 0.9874999999999999 | 0 |
| 0.9881944444444444 | 0 |
| 0.9888888888888889 | 0 |
| 0.9895833333333334 | 0 |
| 0.9902777777777777 | 0 |
| 0.9909722222222223 | 0 |
| 0.9916666666666667 | 0 |
| 0.9923611111111111 | 0 |
| 0.9930555555555555 | 0 |
| 0.99375 | 0 |
| 0.9944444444444445 | 0 |
| 0.9951388888888889 | 0 |
| 0.9958333333333332 | 0 |
| 0.9965277777777778 | 0 |
| 0.9972222222222222 | 0 |
| 0.9979166666666667 | 0 |
| 0.998611111111111 | 0 |
| 0.9993055555555556 | 0 |